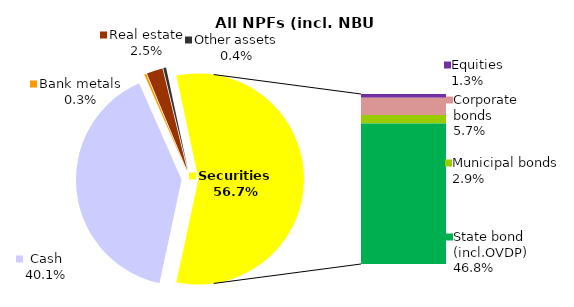
| Category | All NPF (incl. NBU CNPF)* |
|---|---|
| Cash | 1405.671 |
| Bank metals | 11.037 |
| Real estate | 86.884 |
| Other assets | 15.054 |
| Equities | 44.638 |
| Corporate bonds | 199.749 |
| Municipal bonds | 101.979 |
| State bond (incl.OVDP) | 1643.214 |